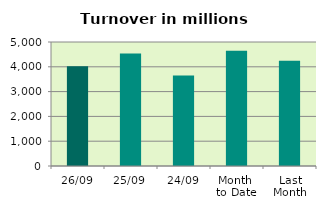
| Category | Series 0 |
|---|---|
| 26/09 | 4020.266 |
| 25/09 | 4540.029 |
| 24/09 | 3645.104 |
| Month 
to Date | 4644.302 |
| Last
Month | 4240.294 |